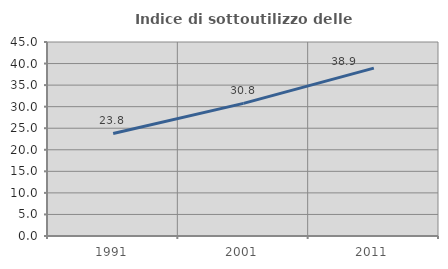
| Category | Indice di sottoutilizzo delle abitazioni  |
|---|---|
| 1991.0 | 23.786 |
| 2001.0 | 30.759 |
| 2011.0 | 38.947 |